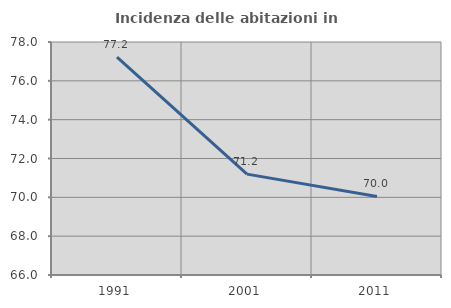
| Category | Incidenza delle abitazioni in proprietà  |
|---|---|
| 1991.0 | 77.222 |
| 2001.0 | 71.196 |
| 2011.0 | 70.046 |